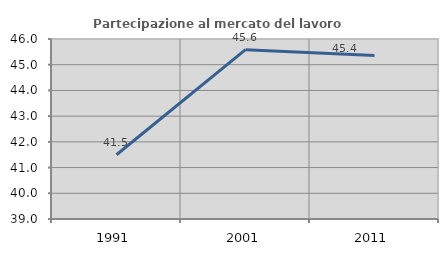
| Category | Partecipazione al mercato del lavoro  femminile |
|---|---|
| 1991.0 | 41.499 |
| 2001.0 | 45.585 |
| 2011.0 | 45.361 |